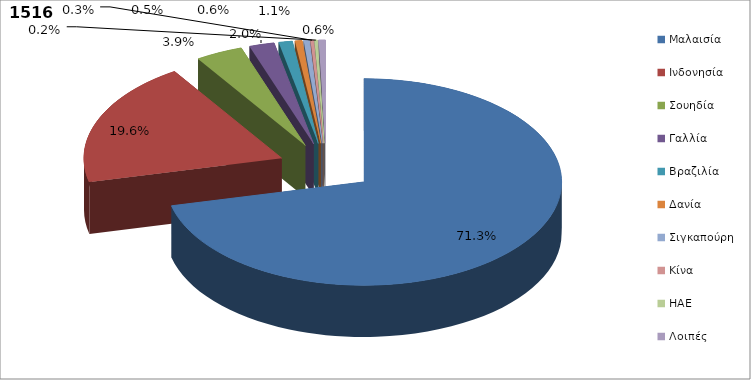
| Category | Series 0 |
|---|---|
| Μαλαισία | 0.713 |
| Ινδονησία | 0.196 |
| Σουηδία | 0.039 |
| Γαλλία | 0.02 |
| Βραζιλία | 0.011 |
| Δανία | 0.006 |
| Σιγκαπούρη | 0.005 |
| Κίνα | 0.003 |
| ΗΑΕ | 0.002 |
| Λοιπές | 0.006 |